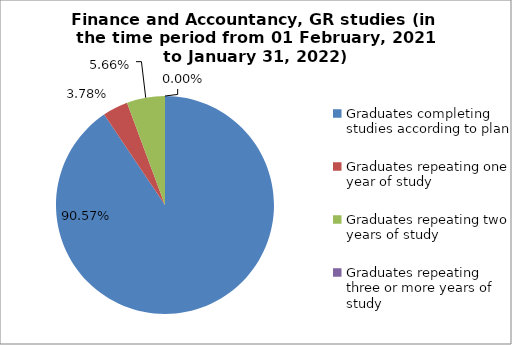
| Category | Series 0 |
|---|---|
| Graduates completing studies according to plan | 90.566 |
| Graduates repeating one year of study | 3.774 |
| Graduates repeating two years of study | 5.66 |
| Graduates repeating three or more years of study | 0 |